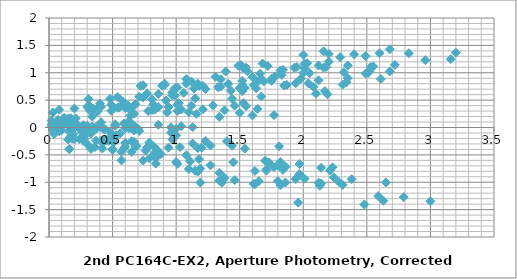
| Category | Series 0 |
|---|---|
| 1.9399999999999995 | 0.807 |
| 0.23000000000000043 | 0.04 |
| 0.1999999999999993 | -0.214 |
| 0.9700000000000006 | 0.588 |
| 0.370000000000001 | -0.242 |
| 0.17999999999999972 | -0.202 |
| 0.8499999999999996 | -0.465 |
| 1.9800000000000004 | 0.892 |
| 0.7099999999999991 | 0.562 |
| 2.3499999999999996 | 0.902 |
| 1.3100000000000005 | 0.926 |
| 0.14000000000000057 | 0.119 |
| 0.8100000000000005 | 0.516 |
| 1.1500000000000004 | 0.533 |
| 0.5399999999999991 | 0.558 |
| 1.83 | 0.961 |
| 0.6500000000000004 | -0.446 |
| 0.20999999999999908 | 0.167 |
| 0.11999999999999922 | 0.175 |
| 1.67 | 0.565 |
| 1.3499999999999996 | 0.879 |
| 0.02999999999999936 | -0.043 |
| 1.6400000000000006 | 0.839 |
| 0.3000000000000007 | -0.102 |
| 1.75 | 0.89 |
| 2.3100000000000005 | 0.783 |
| 1.709999999999999 | -0.767 |
| 2.139999999999999 | -1.021 |
| 0.9699999999999989 | -0.219 |
| 2.3100000000000005 | -1.049 |
| 2.119999999999999 | -1.009 |
| 2.789999999999999 | -1.272 |
| 0.040000000000000924 | 0.085 |
| 1.2300000000000004 | -0.245 |
| 0.41000000000000014 | 0.095 |
| 0.629999999999999 | 0.119 |
| 1.799999999999999 | -0.688 |
| 1.129999999999999 | -0.291 |
| 0.7899999999999991 | -0.274 |
| 1.4000000000000004 | -0.249 |
| 0.10999999999999943 | 0.154 |
| 2.59 | -1.253 |
| 1.7300000000000004 | -0.64 |
| 1.8200000000000003 | -0.632 |
| 0.2699999999999996 | -0.242 |
| 0.5899999999999999 | 0.072 |
| 1.9699999999999989 | -0.85 |
| 0.29999999999999893 | 0.032 |
| 2.24 | -0.909 |
| 0.1899999999999995 | 0.083 |
| 0.370000000000001 | -0.024 |
| 0.4299999999999997 | -0.254 |
| 0.7400000000000002 | 0.548 |
| 0.6000000000000014 | -0.282 |
| 0.41000000000000014 | -0.242 |
| 1.08 | -0.506 |
| 1.75 | 0.851 |
| 0.47999999999999865 | 0.522 |
| 2.119999999999999 | 0.862 |
| 1.08 | 0.885 |
| 0.08999999999999986 | 0.078 |
| 0.5800000000000001 | 0.476 |
| 0.9199999999999999 | 0.493 |
| 0.3099999999999987 | 0.518 |
| 1.5999999999999996 | 0.921 |
| 0.8800000000000008 | -0.486 |
| 0.02000000000000135 | 0.126 |
| 0.11000000000000121 | 0.135 |
| 1.4399999999999995 | 0.525 |
| 1.1199999999999992 | 0.839 |
| 0.2599999999999998 | -0.083 |
| 1.4100000000000001 | 0.798 |
| 0.5300000000000011 | -0.142 |
| 1.5199999999999996 | 0.85 |
| 2.08 | 0.743 |
| 1.17 | 0.802 |
| 0.1700000000000017 | -0.028 |
| 0.019999999999999574 | 0.012 |
| 0.6500000000000004 | -0.251 |
| 2.1799999999999997 | 1.106 |
| 0.9099999999999984 | 0.776 |
| 2.549999999999999 | 1.116 |
| 1.5099999999999998 | 1.139 |
| 0.33999999999999986 | 0.333 |
| 1.0099999999999998 | 0.73 |
| 1.3499999999999996 | 0.747 |
| 0.7399999999999984 | 0.772 |
| 2.0299999999999994 | 1.175 |
| 0.45000000000000107 | -0.232 |
| 0.40999999999999837 | 0.38 |
| 0.3199999999999985 | 0.389 |
| 1.8699999999999992 | 0.779 |
| 1.549999999999999 | 1.093 |
| 0.16999999999999993 | 0.171 |
| 1.8399999999999999 | 1.053 |
| 0.10000000000000142 | 0.112 |
| 1.9499999999999993 | 1.104 |
| 2.51 | 0.997 |
| 1.3400000000000016 | -0.83 |
| 1.1500000000000004 | -0.79 |
| 1.8200000000000003 | -1.054 |
| 1.0099999999999998 | 0.303 |
| 0.26000000000000156 | -0.026 |
| 1.379999999999999 | 0.314 |
| 0.33999999999999986 | 0.337 |
| 0.8300000000000001 | -0.469 |
| 0.16000000000000014 | -0.072 |
| 0.17999999999999972 | -0.055 |
| 0.4300000000000015 | -0.03 |
| 0.8599999999999994 | 0.373 |
| 1.620000000000001 | -1.034 |
| 0.7600000000000016 | -0.422 |
| 0.8500000000000014 | -0.413 |
| 0.6999999999999993 | -0.023 |
| 0.379999999999999 | 0.291 |
| 1.0 | -0.631 |
| 0.6699999999999999 | 0.25 |
| 1.2700000000000014 | -0.69 |
| 0.7799999999999994 | 0.302 |
| 1.3399999999999999 | 0.195 |
| 0.19000000000000128 | 0.04 |
| 0.47999999999999865 | -0.224 |
| 2.3500000000000014 | 1.133 |
| 1.08 | 0.804 |
| 2.7200000000000006 | 1.144 |
| 1.6800000000000015 | 1.167 |
| 0.5100000000000016 | 0.36 |
| 1.1800000000000015 | 0.758 |
| 1.5200000000000014 | 0.775 |
| 0.9100000000000001 | 0.8 |
| 2.200000000000001 | 1.203 |
| 0.27999999999999936 | -0.204 |
| 0.5800000000000001 | 0.408 |
| 0.4900000000000002 | 0.417 |
| 2.040000000000001 | 0.807 |
| 1.7200000000000006 | 1.121 |
| 0.34000000000000163 | 0.198 |
| 2.0100000000000016 | 1.08 |
| 0.07000000000000028 | 0.139 |
| 2.120000000000001 | 1.132 |
| 2.6800000000000015 | 1.025 |
| 0.6699999999999999 | -0.263 |
| 2.16 | 1.094 |
| 0.8899999999999988 | 0.764 |
| 2.5299999999999994 | 1.104 |
| 1.4900000000000002 | 1.128 |
| 0.3200000000000003 | 0.321 |
| 0.9900000000000002 | 0.718 |
| 1.33 | 0.735 |
| 0.7199999999999989 | 0.76 |
| 2.01 | 1.163 |
| 0.47000000000000064 | -0.244 |
| 0.3899999999999988 | 0.369 |
| 0.29999999999999893 | 0.377 |
| 1.8499999999999996 | 0.767 |
| 1.5299999999999994 | 1.081 |
| 0.15000000000000036 | 0.159 |
| 1.8200000000000003 | 1.041 |
| 0.120000000000001 | 0.1 |
| 1.9299999999999997 | 1.092 |
| 2.49 | 0.985 |
| 2.83 | 1.357 |
| 1.5599999999999987 | 1.028 |
| 3.1999999999999993 | 1.368 |
| 2.16 | 1.391 |
| 0.9900000000000002 | 0.584 |
| 1.6600000000000001 | 0.981 |
| 2.0 | 0.999 |
| 1.3899999999999988 | 1.023 |
| 2.6799999999999997 | 1.427 |
| 0.1999999999999993 | 0.019 |
| 1.0599999999999987 | 0.632 |
| 0.9699999999999989 | 0.641 |
| 2.5199999999999996 | 1.03 |
| 2.1999999999999993 | 1.344 |
| 0.8200000000000003 | 0.422 |
| 2.49 | 1.304 |
| 0.5499999999999989 | 0.363 |
| 2.5999999999999996 | 1.356 |
| 3.16 | 1.249 |
| 1.2700000000000014 | -0.33 |
| 0.3699999999999992 | 0.011 |
| 0.6699999999999999 | 0.034 |
| 1.8399999999999999 | -0.773 |
| 1.17 | -0.376 |
| 0.8300000000000001 | -0.359 |
| 1.4400000000000013 | -0.334 |
| 0.15000000000000036 | 0.07 |
| 2.630000000000001 | -1.338 |
| 1.7700000000000014 | -0.725 |
| 1.8600000000000012 | -0.716 |
| 0.3100000000000005 | -0.327 |
| 0.6300000000000008 | -0.013 |
| 2.01 | -0.935 |
| 0.33999999999999986 | -0.053 |
| 2.280000000000001 | -0.994 |
| 0.23000000000000043 | -0.001 |
| 0.33000000000000007 | -0.108 |
| 1.6400000000000006 | 0.34 |
| 0.6000000000000014 | 0.363 |
| 0.5699999999999985 | -0.443 |
| 0.10000000000000142 | -0.046 |
| 0.4400000000000013 | -0.029 |
| 0.16999999999999993 | -0.004 |
| 1.120000000000001 | 0.399 |
| 1.3599999999999994 | -1.008 |
| 0.5 | -0.396 |
| 0.5899999999999999 | -0.387 |
| 0.9600000000000009 | 0.003 |
| 0.6400000000000006 | 0.317 |
| 0.7399999999999984 | -0.605 |
| 0.9300000000000015 | 0.277 |
| 1.0099999999999998 | -0.664 |
| 1.040000000000001 | 0.328 |
| 1.6000000000000014 | 0.221 |
| 1.0399999999999991 | 0.023 |
| 2.209999999999999 | -0.784 |
| 1.5399999999999991 | -0.386 |
| 1.1999999999999993 | -0.369 |
| 1.8100000000000005 | -0.344 |
| 0.5199999999999996 | 0.059 |
| 3.0 | -1.348 |
| 2.1400000000000006 | -0.736 |
| 2.2300000000000004 | -0.727 |
| 0.6799999999999997 | -0.337 |
| 1.0 | -0.023 |
| 2.379999999999999 | -0.945 |
| 0.7099999999999991 | -0.064 |
| 2.6500000000000004 | -1.004 |
| 0.5999999999999996 | -0.012 |
| 0.03999999999999915 | -0.119 |
| 1.17 | -0.807 |
| 0.5 | -0.41 |
| 0.16000000000000014 | -0.392 |
| 0.7700000000000014 | -0.368 |
| 0.5199999999999996 | 0.036 |
| 1.9600000000000009 | -1.372 |
| 1.1000000000000014 | -0.759 |
| 1.1900000000000013 | -0.75 |
| 0.35999999999999943 | -0.361 |
| 0.03999999999999915 | -0.047 |
| 1.3399999999999999 | -0.969 |
| 0.33000000000000007 | -0.087 |
| 1.6100000000000012 | -1.028 |
| 0.4399999999999995 | -0.035 |
| 1.0 | -0.142 |
| 0.6699999999999999 | 0.397 |
| 1.0099999999999998 | 0.414 |
| 0.3999999999999986 | 0.439 |
| 1.6899999999999995 | 0.843 |
| 0.7900000000000009 | -0.565 |
| 0.06999999999999851 | 0.048 |
| 0.02000000000000135 | 0.057 |
| 1.5299999999999994 | 0.446 |
| 1.209999999999999 | 0.76 |
| 0.16999999999999993 | -0.162 |
| 1.5 | 0.72 |
| 0.4400000000000013 | -0.221 |
| 1.6099999999999994 | 0.772 |
| 2.17 | 0.664 |
| 0.33999999999999986 | 0.017 |
| 0.27000000000000135 | 0.042 |
| 1.0199999999999996 | 0.445 |
| 1.4600000000000009 | -0.962 |
| 0.6000000000000014 | -0.349 |
| 0.6900000000000013 | -0.34 |
| 0.8599999999999994 | 0.049 |
| 0.5399999999999991 | 0.363 |
| 0.8399999999999999 | -0.559 |
| 0.8300000000000001 | 0.323 |
| 1.1100000000000012 | -0.618 |
| 0.9399999999999995 | 0.375 |
| 1.5 | 0.267 |
| 0.6100000000000012 | 0.025 |
| 0.6799999999999997 | 0.428 |
| 1.8000000000000007 | -0.979 |
| 0.9400000000000013 | -0.367 |
| 1.0300000000000011 | -0.358 |
| 0.5199999999999996 | 0.032 |
| 0.1999999999999993 | 0.346 |
| 1.1799999999999997 | -0.576 |
| 0.4900000000000002 | 0.306 |
| 1.450000000000001 | -0.635 |
| 0.5999999999999996 | 0.357 |
| 1.1600000000000001 | 0.25 |
| 1.290000000000001 | 0.403 |
| 1.1899999999999995 | -1.004 |
| 0.33000000000000007 | -0.391 |
| 0.41999999999999993 | -0.383 |
| 1.1300000000000008 | 0.007 |
| 0.8100000000000005 | 0.321 |
| 0.5699999999999985 | -0.601 |
| 1.1000000000000014 | 0.281 |
| 0.8399999999999999 | -0.66 |
| 1.2100000000000009 | 0.332 |
| 1.7700000000000014 | 0.225 |
| 2.4800000000000004 | -1.407 |
| 1.620000000000001 | -0.795 |
| 1.7100000000000009 | -0.786 |
| 0.16000000000000014 | -0.396 |
| 0.4800000000000004 | -0.082 |
| 1.8599999999999994 | -1.004 |
| 0.1899999999999995 | -0.123 |
| 2.130000000000001 | -1.063 |
| 0.08000000000000007 | -0.071 |
| 0.4800000000000004 | -0.178 |
| 0.8599999999999994 | 0.613 |
| 0.7699999999999996 | 0.621 |
| 2.3200000000000003 | 1.011 |
| 2.0 | 1.325 |
| 0.620000000000001 | 0.403 |
| 2.290000000000001 | 1.285 |
| 0.34999999999999964 | 0.344 |
| 2.4000000000000004 | 1.336 |
| 2.960000000000001 | 1.229 |
| 0.08999999999999986 | 0.009 |
| 1.4600000000000009 | 0.398 |
| 1.1400000000000006 | 0.712 |
| 0.23999999999999844 | -0.21 |
| 1.4300000000000015 | 0.672 |
| 0.5099999999999998 | -0.269 |
| 1.540000000000001 | 0.724 |
| 2.1000000000000014 | 0.617 |
| 1.5500000000000007 | 0.39 |
| 1.2300000000000004 | 0.704 |
| 0.14999999999999858 | -0.219 |
| 1.5200000000000014 | 0.663 |
| 0.41999999999999993 | -0.278 |
| 1.6300000000000008 | 0.715 |
| 2.1900000000000013 | 0.608 |
| 0.3200000000000003 | 0.314 |
| 1.6999999999999993 | -0.608 |
| 0.02999999999999936 | 0.274 |
| 1.9700000000000006 | -0.667 |
| 0.08000000000000007 | 0.325 |
| 0.6400000000000006 | 0.218 |
| 1.379999999999999 | -0.922 |
| 0.2900000000000009 | -0.04 |
| 1.6500000000000004 | -0.981 |
| 0.40000000000000036 | 0.011 |
| 0.9600000000000009 | -0.096 |
| 1.67 | 0.882 |
| 0.27000000000000135 | -0.059 |
| 1.7799999999999994 | 0.934 |
| 2.34 | 0.826 |
| 1.9400000000000013 | -0.941 |
| 0.10999999999999943 | 0.052 |
| 0.6699999999999999 | -0.055 |
| 2.0500000000000007 | 0.993 |
| 2.610000000000001 | 0.885 |
| 0.5600000000000005 | -0.107 |